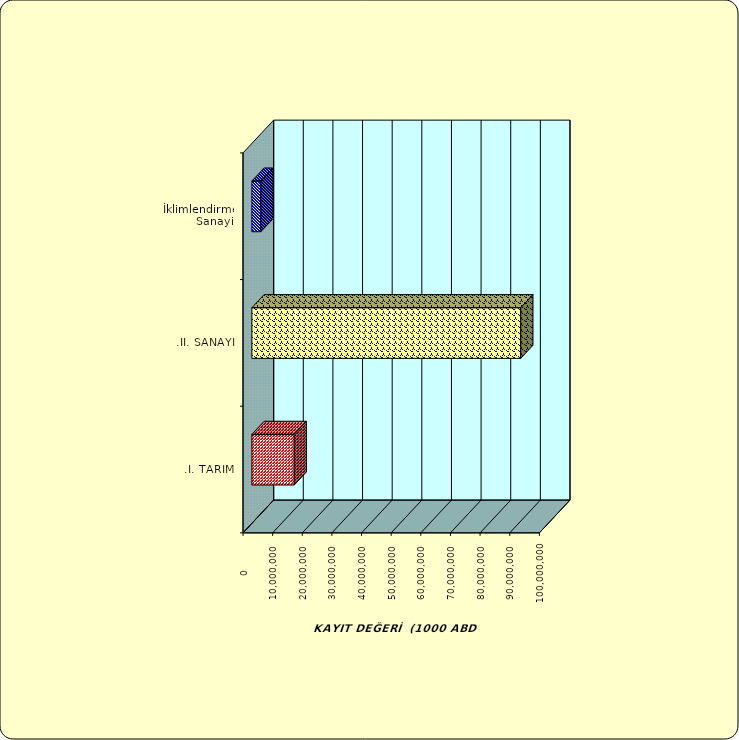
| Category | Series 0 |
|---|---|
| .I. TARIM | 14279133.904 |
| .II. SANAYİ | 90720309.966 |
|  İklimlendirme Sanayii | 3036337.078 |